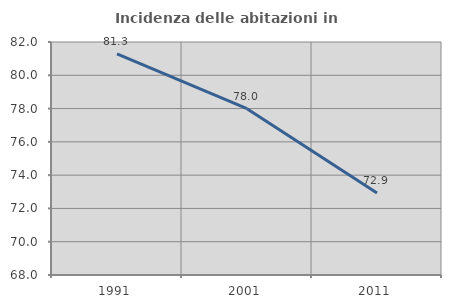
| Category | Incidenza delle abitazioni in proprietà  |
|---|---|
| 1991.0 | 81.288 |
| 2001.0 | 77.994 |
| 2011.0 | 72.92 |